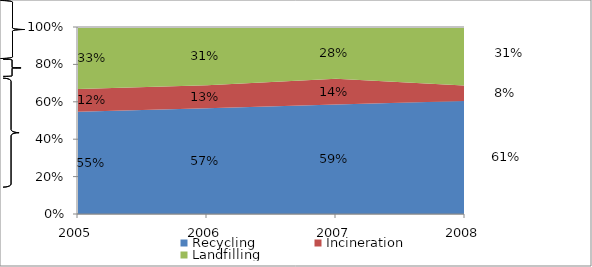
| Category | Recycling | Incineration | Landfilling |
|---|---|---|---|
| 2005.0 | 0.546 | 0.122 | 0.332 |
| 2006.0 | 0.569 | 0.125 | 0.313 |
| 2007.0 | 0.592 | 0.139 | 0.279 |
| 2008.0 | 0.605 | 0.082 | 0.313 |